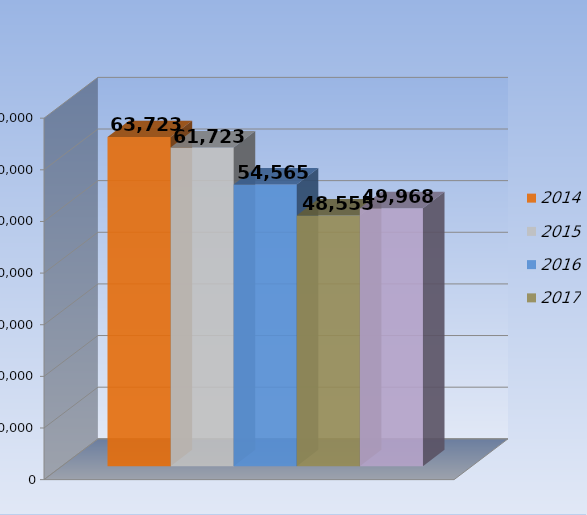
| Category | 2014 | 2015 | 2016 | 2017 | 2018 |
|---|---|---|---|---|---|
| 0 | 63723 | 61723 | 54565 | 48555 | 49968 |